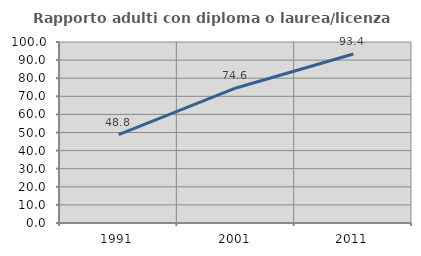
| Category | Rapporto adulti con diploma o laurea/licenza media  |
|---|---|
| 1991.0 | 48.832 |
| 2001.0 | 74.602 |
| 2011.0 | 93.388 |